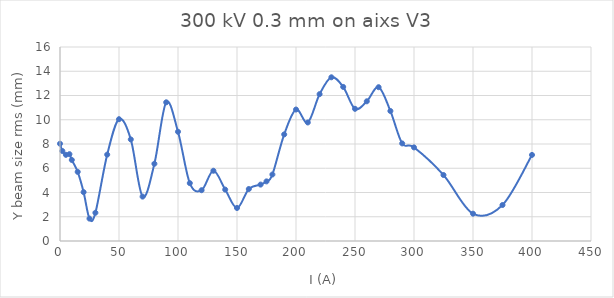
| Category | Series 0 |
|---|---|
| 0.0 | 8.023 |
| 2.0 | 7.421 |
| 5.0 | 7.107 |
| 8.0 | 7.16 |
| 10.0 | 6.685 |
| 15.0 | 5.701 |
| 20.0 | 4.031 |
| 25.0 | 1.846 |
| 30.0 | 2.329 |
| 40.0 | 7.124 |
| 50.0 | 10.045 |
| 60.0 | 8.378 |
| 70.0 | 3.662 |
| 80.0 | 6.371 |
| 90.0 | 11.439 |
| 100.0 | 9.009 |
| 110.0 | 4.773 |
| 120.0 | 4.189 |
| 130.0 | 5.794 |
| 140.0 | 4.24 |
| 150.0 | 2.724 |
| 160.0 | 4.286 |
| 170.0 | 4.653 |
| 175.0 | 4.916 |
| 180.0 | 5.484 |
| 190.0 | 8.793 |
| 200.0 | 10.843 |
| 210.0 | 9.776 |
| 220.0 | 12.112 |
| 230.0 | 13.502 |
| 240.0 | 12.708 |
| 250.0 | 10.902 |
| 260.0 | 11.522 |
| 270.0 | 12.684 |
| 280.0 | 10.722 |
| 290.0 | 8.047 |
| 300.0 | 7.719 |
| 325.0 | 5.441 |
| 350.0 | 2.253 |
| 375.0 | 2.968 |
| 400.0 | 7.1 |